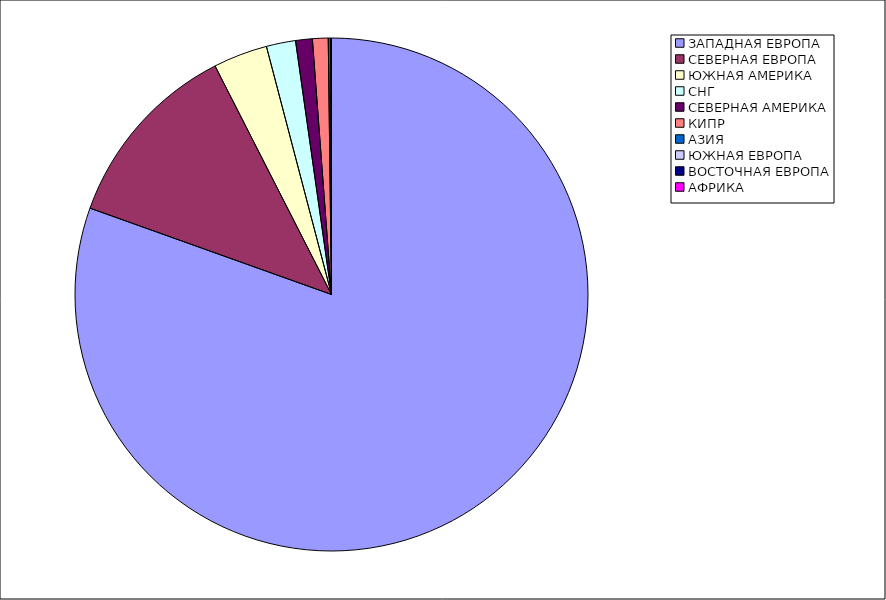
| Category | Оборот |
|---|---|
| ЗАПАДНАЯ ЕВРОПА | 0.805 |
| СЕВЕРНАЯ ЕВРОПА | 0.12 |
| ЮЖНАЯ АМЕРИКА | 0.034 |
| СНГ | 0.018 |
| СЕВЕРНАЯ АМЕРИКА | 0.011 |
| КИПР | 0.01 |
| АЗИЯ | 0.002 |
| ЮЖНАЯ ЕВРОПА | 0 |
| ВОСТОЧНАЯ ЕВРОПА | 0 |
| АФРИКА | 0 |